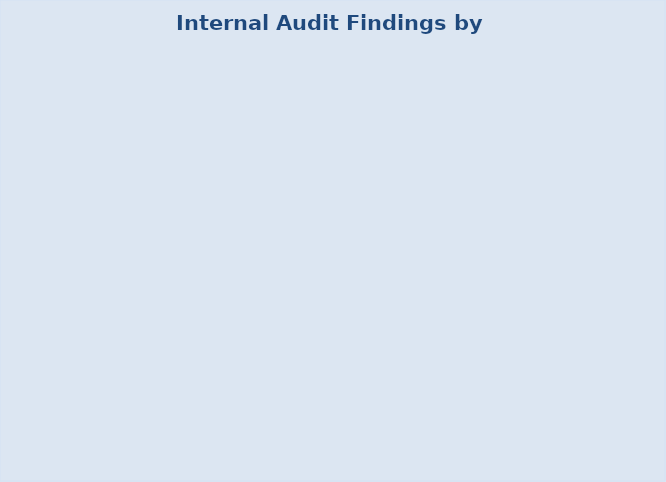
| Category | Series 0 |
|---|---|
| Corrective Actions to Date | 0 |
| Preventive Actions to Date | 0 |
| Opportunities to Date | 0 |